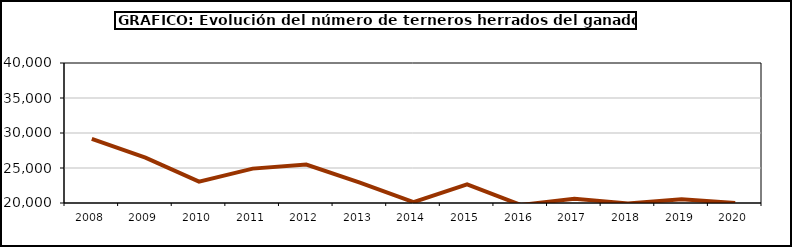
| Category | Ganado de Lidia |
|---|---|
| 2008.0 | 29147 |
| 2009.0 | 26477 |
| 2010.0 | 23052 |
| 2011.0 | 24912 |
| 2012.0 | 25485 |
| 2013.0 | 22909 |
| 2014.0 | 20127 |
| 2015.0 | 22647 |
| 2016.0 | 19726 |
| 2017.0 | 20623 |
| 2018.0 | 19942 |
| 2019.0 | 20534 |
| 2020.0 | 20001 |